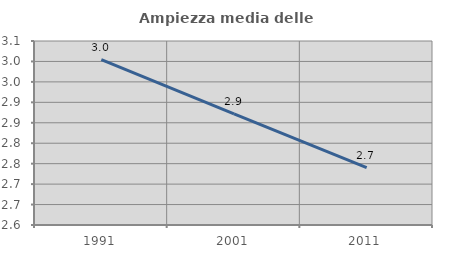
| Category | Ampiezza media delle famiglie |
|---|---|
| 1991.0 | 3.004 |
| 2001.0 | 2.872 |
| 2011.0 | 2.74 |